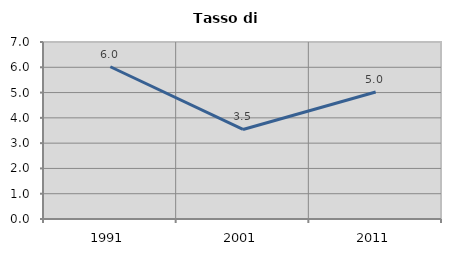
| Category | Tasso di disoccupazione   |
|---|---|
| 1991.0 | 6.021 |
| 2001.0 | 3.542 |
| 2011.0 | 5.022 |